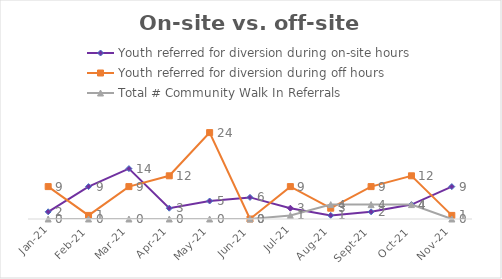
| Category | Youth referred for diversion during on-site hours | Youth referred for diversion during off hours | Total # Community Walk In Referrals |
|---|---|---|---|
| 2021-01-01 | 2 | 9 | 0 |
| 2021-02-01 | 9 | 1 | 0 |
| 2021-03-01 | 14 | 9 | 0 |
| 2021-04-01 | 3 | 12 | 0 |
| 2021-05-01 | 5 | 24 | 0 |
| 2021-06-01 | 6 | 0 | 0 |
| 2021-07-01 | 3 | 9 | 1 |
| 2021-08-01 | 1 | 3 | 4 |
| 2021-09-01 | 2 | 9 | 4 |
| 2021-10-01 | 4 | 12 | 4 |
| 2021-11-01 | 9 | 1 | 0 |